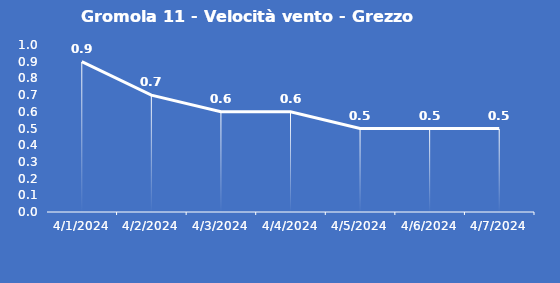
| Category | Gromola 11 - Velocità vento - Grezzo (m/s) |
|---|---|
| 4/1/24 | 0.9 |
| 4/2/24 | 0.7 |
| 4/3/24 | 0.6 |
| 4/4/24 | 0.6 |
| 4/5/24 | 0.5 |
| 4/6/24 | 0.5 |
| 4/7/24 | 0.5 |